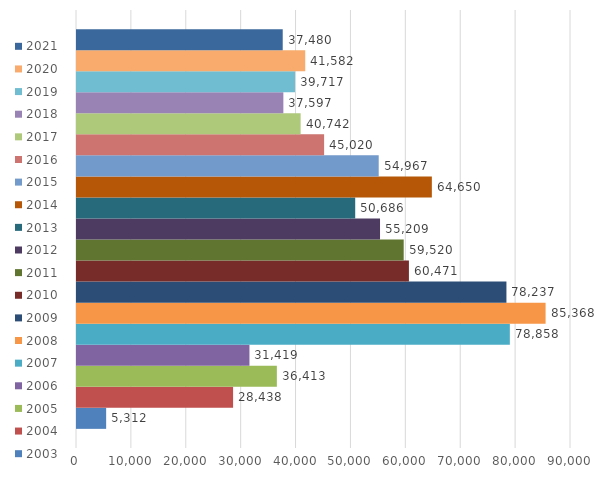
| Category | 2003 | 2004 | 2005 | 2006 | 2007 | 2008 | 2009 | 2010 | 2011 | 2012 | 2013 | 2014 | 2015 | 2016 | 2017 | 2018 | 2019 | 2020 | 2021 |
|---|---|---|---|---|---|---|---|---|---|---|---|---|---|---|---|---|---|---|---|
| 0 | 5312 | 28438 | 36413 | 31419 | 78858 | 85368 | 78237 | 60471 | 59520 | 55209 | 50686 | 64650 | 54967 | 45020 | 40742 | 37597 | 39717 | 41582 | 37480 |